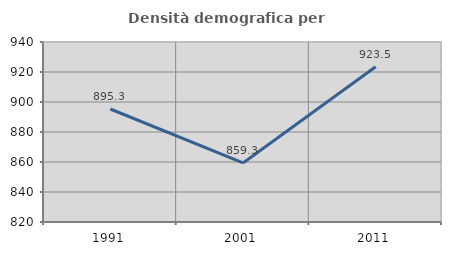
| Category | Densità demografica |
|---|---|
| 1991.0 | 895.342 |
| 2001.0 | 859.347 |
| 2011.0 | 923.462 |